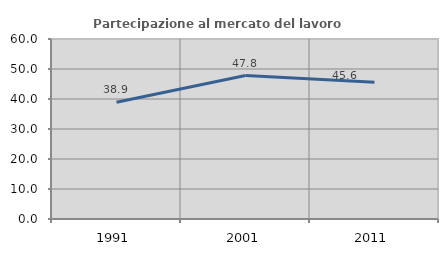
| Category | Partecipazione al mercato del lavoro  femminile |
|---|---|
| 1991.0 | 38.937 |
| 2001.0 | 47.806 |
| 2011.0 | 45.578 |